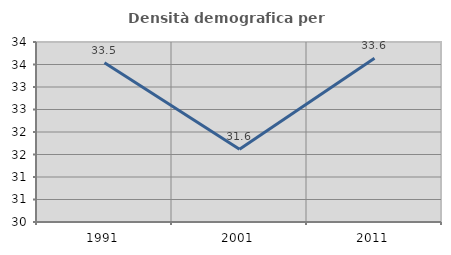
| Category | Densità demografica |
|---|---|
| 1991.0 | 33.54 |
| 2001.0 | 31.614 |
| 2011.0 | 33.641 |